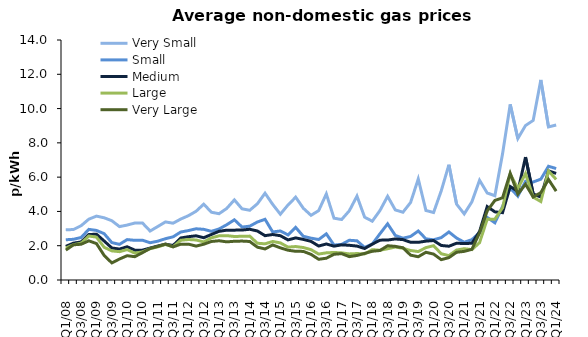
| Category | Very Small | Small | Medium | Large | Very Large |
|---|---|---|---|---|---|
| Q1/08  | 2.927 | 2.347 | 1.962 | 1.862 | 1.743 |
| Q2/08  | 2.945 | 2.375 | 2.15 | 2.059 | 2.053 |
| Q3/08  | 3.168 | 2.48 | 2.222 | 2.148 | 2.085 |
| Q4/08  | 3.548 | 2.954 | 2.651 | 2.566 | 2.286 |
| Q1/09  | 3.727 | 2.892 | 2.672 | 2.501 | 2.124 |
| Q2/09  | 3.63 | 2.703 | 2.276 | 1.909 | 1.436 |
| Q3/09  | 3.458 | 2.184 | 1.869 | 1.7 | 0.998 |
| Q4/09  | 3.116 | 2.079 | 1.803 | 1.653 | 1.224 |
| Q1/10  | 3.205 | 2.357 | 1.94 | 1.775 | 1.418 |
| Q2/10  | 3.322 | 2.314 | 1.742 | 1.568 | 1.361 |
| Q3/10  | 3.326 | 2.323 | 1.742 | 1.642 | 1.593 |
| Q4/10  | 2.857 | 2.173 | 1.863 | 1.827 | 1.84 |
| Q1/11  | 3.12 | 2.263 | 1.982 | 1.933 | 1.959 |
| Q2/11  | 3.388 | 2.409 | 2.094 | 2.072 | 2.091 |
| Q3/11  | 3.313 | 2.518 | 2.012 | 1.939 | 1.933 |
| Q4/11  | 3.555 | 2.799 | 2.451 | 2.317 | 2.089 |
| Q1/12  | 3.752 | 2.883 | 2.525 | 2.361 | 2.093 |
| Q2/12  | 4.009 | 2.988 | 2.579 | 2.336 | 1.978 |
| Q3/12  | 4.425 | 2.955 | 2.466 | 2.222 | 2.087 |
| Q4/12  | 3.953 | 2.839 | 2.655 | 2.461 | 2.247 |
| Q1/13  | 3.867 | 2.977 | 2.84 | 2.577 | 2.29 |
| Q2/13  | 4.175 | 3.223 | 2.906 | 2.588 | 2.224 |
| Q3/13  | 4.673 | 3.511 | 2.908 | 2.539 | 2.259 |
| Q4/13  | 4.153 | 3.089 | 2.914 | 2.55 | 2.27 |
| Q1/14  | 4.067 | 3.14 | 2.959 | 2.56 | 2.246 |
| Q2/14  | 4.445 | 3.383 | 2.859 | 2.144 | 1.916 |
| Q3/14  | 5.063 | 3.54 | 2.586 | 2.111 | 1.812 |
| Q4/14  | 4.411 | 2.803 | 2.654 | 2.247 | 2.044 |
| Q1/15  | 3.837 | 2.861 | 2.584 | 2.165 | 1.875 |
| Q2/15  | 4.378 | 2.63 | 2.339 | 1.919 | 1.737 |
| Q3/15  | 4.832 | 3.068 | 2.456 | 1.952 | 1.674 |
| Q4/15  | 4.184 | 2.549 | 2.367 | 1.894 | 1.668 |
| Q1/16  | 3.773 | 2.441 | 2.254 | 1.771 | 1.497 |
| Q2/16  | 4.046 | 2.361 | 1.981 | 1.514 | 1.208 |
| Q3/16  | 5.021 | 2.692 | 2.101 | 1.584 | 1.27 |
| Q4/16  | 3.606 | 2.04 | 1.974 | 1.607 | 1.502 |
| Q1/17  | 3.529 | 2.079 | 2.05 | 1.583 | 1.536 |
| Q2/17  | 4.037 | 2.318 | 2.024 | 1.522 | 1.363 |
| Q3/17  | 4.892 | 2.286 | 1.978 | 1.543 | 1.43 |
| Q4/17  | 3.665 | 1.9 | 1.836 | 1.522 | 1.55 |
| Q1/18  | 3.43 | 2.099 | 2.09 | 1.77 | 1.675 |
| Q2/18  | 4.053 | 2.697 | 2.325 | 1.736 | 1.721 |
| Q3/18  | 4.883 | 3.277 | 2.33 | 1.822 | 1.999 |
| Q4/18  | 4.088 | 2.601 | 2.395 | 1.924 | 1.962 |
| Q1/19  | 3.953 | 2.437 | 2.355 | 1.849 | 1.881 |
| Q2/19  | 4.522 | 2.541 | 2.202 | 1.72 | 1.448 |
| Q3/19  | 5.895 | 2.859 | 2.197 | 1.659 | 1.357 |
| Q4/19  | 4.056 | 2.4 | 2.267 | 1.888 | 1.618 |
| Q1/20  | 3.937 | 2.345 | 2.302 | 2.001 | 1.511 |
| Q2/20  | 5.202 | 2.472 | 2.015 | 1.53 | 1.187 |
| Q3/20  | 6.724 | 2.802 | 1.97 | 1.423 | 1.305 |
| Q4/20  | 4.429 | 2.448 | 2.145 | 1.748 | 1.617 |
| Q1/21  | 3.859 | 2.201 | 2.126 | 1.827 | 1.67 |
| Q2/21  | 4.561 | 2.356 | 2.143 | 1.771 | 1.789 |
| Q3/21  | 5.819 | 2.759 | 2.826 | 2.18 | 2.749 |
| Q4/21  | 5.073 | 3.651 | 4.283 | 3.547 | 4.027 |
| Q1/22  | 4.913 | 3.338 | 3.975 | 3.549 | 4.642 |
| Q2/22  | 7.357 | 4.283 | 3.929 | 4.211 | 4.795 |
| Q3/22  | 10.242 | 5.371 | 5.455 | 6.181 | 6.225 |
| Q4/22  | 8.251 | 4.889 | 5.165 | 5.342 | 5.01 |
| Q1/23  | 9.006 | 5.757 | 7.167 | 6.209 | 5.586 |
| Q2/23  | 9.309 | 5.718 | 5.02 | 4.831 | 4.839 |
| Q3/23  | 11.673 | 5.883 | 4.838 | 4.577 | 5.1 |
| Q4/23  | 8.928 | 6.633 | 6.365 | 6.357 | 5.865 |
| Q1/24  | 9.046 | 6.502 | 6.218 | 5.868 | 5.183 |